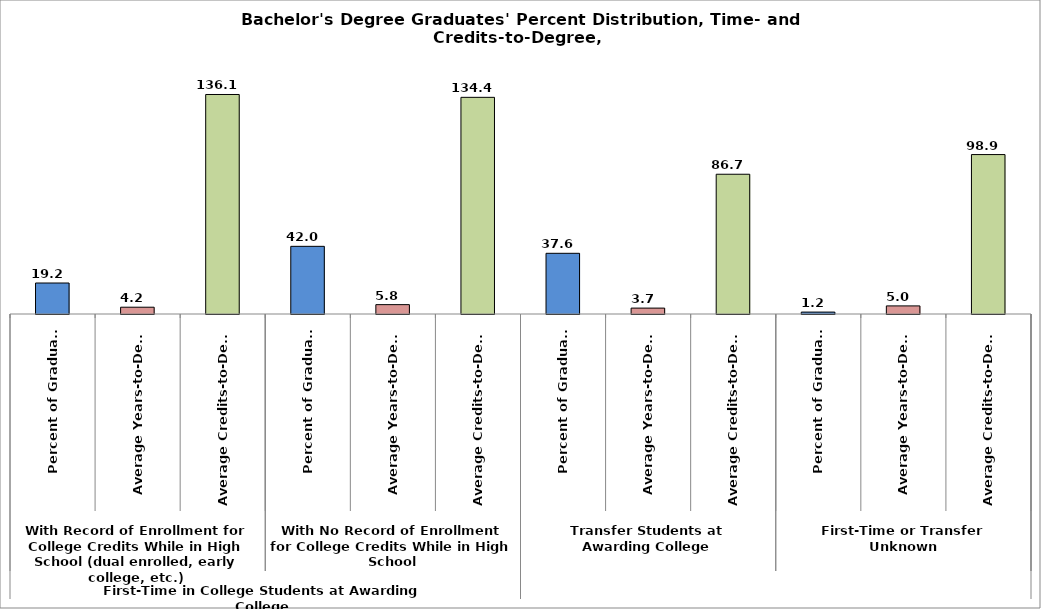
| Category | Series 0 |
|---|---|
| 0 | 19.215 |
| 1 | 4.213 |
| 2 | 136.126 |
| 3 | 41.96 |
| 4 | 5.805 |
| 5 | 134.362 |
| 6 | 37.642 |
| 7 | 3.654 |
| 8 | 86.67 |
| 9 | 1.182 |
| 10 | 5.025 |
| 11 | 98.869 |